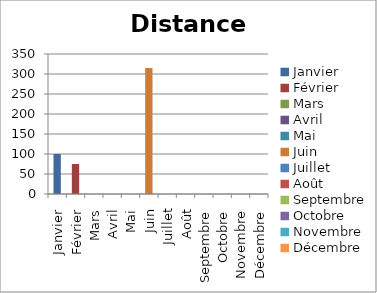
| Category | Distance totale |
|---|---|
| Janvier | 100 |
| Février | 75 |
| Mars | 0 |
| Avril | 0 |
| Mai | 0 |
| Juin | 315 |
| Juillet | 0 |
| Août | 0 |
| Septembre | 0 |
| Octobre | 0 |
| Novembre | 0 |
| Décembre | 0 |